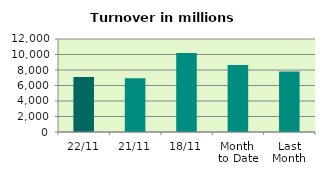
| Category | Series 0 |
|---|---|
| 22/11 | 7084.231 |
| 21/11 | 6949.068 |
| 18/11 | 10202.819 |
| Month 
to Date | 8657.862 |
| Last
Month | 7813.06 |